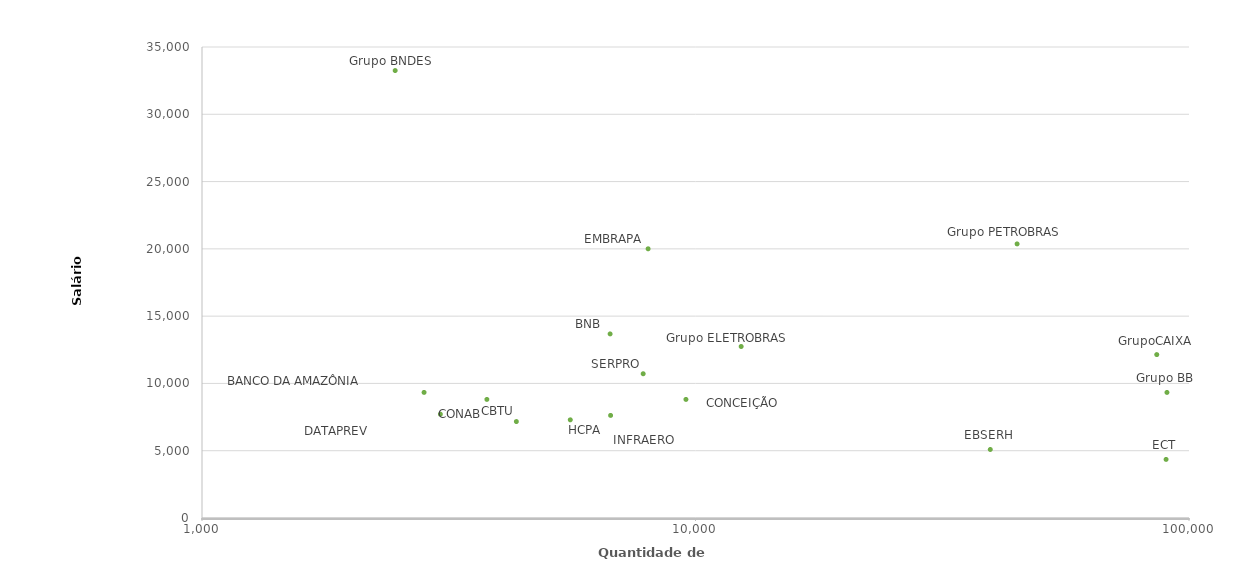
| Category | Qtd. Empregados x Salário Médio (Base 2020) |
|---|---|
| 2818.0 | 9333 |
| 90229.0 | 9330 |
| 6714.0 | 13679 |
| 2463.0 | 33250 |
| 86038.0 | 12143 |
| 4335.0 | 7168 |
| 3778.0 | 8812 |
| 9564.0 | 8812 |
| 3041.0 | 7715 |
| 39564.0 | 5091 |
| 89854.0 | 4354 |
| 12375.0 | 12745 |
| 8016.0 | 20004 |
| 6729.0 | 7624 |
| 5575.0 | 7295 |
| 44839.0 | 20367.61 |
| 7834.0 | 10719 |